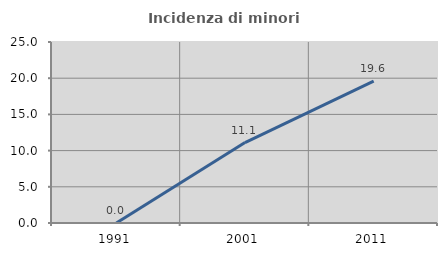
| Category | Incidenza di minori stranieri |
|---|---|
| 1991.0 | 0 |
| 2001.0 | 11.111 |
| 2011.0 | 19.608 |